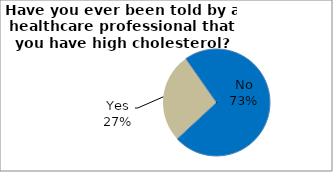
| Category | Series 0 |
|---|---|
| No | 72.821 |
| Yes | 27.179 |